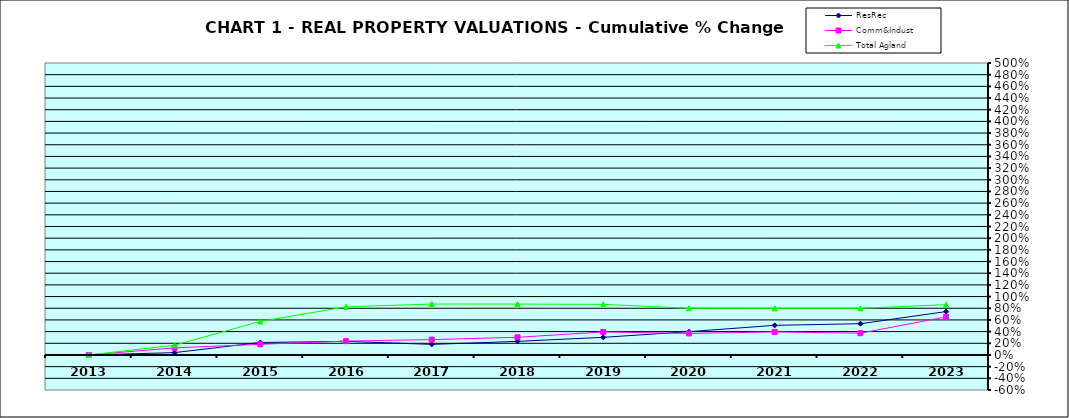
| Category | ResRec | Comm&Indust | Total Agland |
|---|---|---|---|
| 2013.0 | 0 | 0 | 0 |
| 2014.0 | 0.04 | 0.122 | 0.167 |
| 2015.0 | 0.214 | 0.183 | 0.575 |
| 2016.0 | 0.233 | 0.238 | 0.824 |
| 2017.0 | 0.181 | 0.263 | 0.872 |
| 2018.0 | 0.233 | 0.303 | 0.872 |
| 2019.0 | 0.302 | 0.394 | 0.867 |
| 2020.0 | 0.399 | 0.369 | 0.8 |
| 2021.0 | 0.507 | 0.394 | 0.798 |
| 2022.0 | 0.535 | 0.373 | 0.798 |
| 2023.0 | 0.743 | 0.652 | 0.861 |